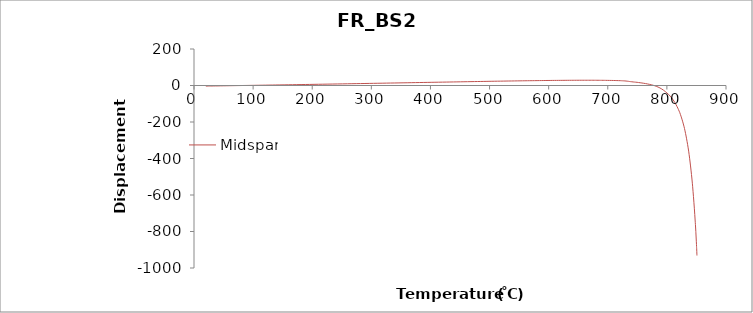
| Category | Midspan |
|---|---|
| 20.0 | -3.166 |
| 22.1093185 | -3.063 |
| 24.218637 | -2.959 |
| 26.3279555 | -2.855 |
| 28.437274 | -2.751 |
| 32.499335 | -2.55 |
| 36.561396 | -2.349 |
| 40.623457 | -2.148 |
| 44.685518 | -1.945 |
| 49.893662 | -1.685 |
| 55.101806 | -1.424 |
| 60.30995 | -1.163 |
| 65.518094 | -0.9 |
| 71.48998275 | -0.598 |
| 77.4618715 | -0.294 |
| 83.43376025 | 0.01 |
| 89.405649 | 0.316 |
| 95.907004 | 0.65 |
| 102.408359 | 0.984 |
| 108.909714 | 1.318 |
| 115.411069 | 1.653 |
| 121.1174785 | 1.948 |
| 126.823888 | 2.244 |
| 132.5302975 | 2.541 |
| 138.236707 | 2.839 |
| 145.3285415 | 3.211 |
| 152.420376 | 3.584 |
| 159.5122105 | 3.959 |
| 166.604045 | 4.336 |
| 173.87464425 | 4.724 |
| 181.1452435 | 5.113 |
| 188.41584275 | 5.504 |
| 195.686442 | 5.897 |
| 203.058233 | 6.294 |
| 210.430024 | 6.69 |
| 217.801815 | 7.088 |
| 225.173606 | 7.487 |
| 233.811487 | 7.957 |
| 242.449368 | 8.429 |
| 251.087249 | 8.904 |
| 259.72513 | 9.38 |
| 267.0905145 | 9.788 |
| 274.455899 | 10.198 |
| 281.8212835 | 10.609 |
| 289.186668 | 11.021 |
| 296.4560575 | 11.43 |
| 303.725447 | 11.838 |
| 310.9948365 | 12.243 |
| 318.264226 | 12.65 |
| 325.384818 | 13.051 |
| 332.50541 | 13.452 |
| 339.626002 | 13.855 |
| 346.746594 | 14.259 |
| 353.67071425 | 14.653 |
| 360.5948345 | 15.048 |
| 367.51895475 | 15.444 |
| 374.443075 | 15.841 |
| 381.12936825 | 16.226 |
| 387.8156615 | 16.612 |
| 394.50195475 | 16.999 |
| 401.188248 | 17.384 |
| 407.6028095 | 17.744 |
| 414.017371 | 18.104 |
| 420.4319325 | 18.465 |
| 426.846494 | 18.826 |
| 432.806323875 | 19.161 |
| 438.76615375 | 19.497 |
| 444.725983625 | 19.832 |
| 450.6858135 | 20.168 |
| 456.645643375 | 20.503 |
| 462.60547325 | 20.839 |
| 468.565303125 | 21.174 |
| 474.525133 | 21.508 |
| 479.42299225 | 21.782 |
| 484.3208515 | 22.056 |
| 489.21871075 | 22.329 |
| 494.11657 | 22.602 |
| 499.01442925 | 22.874 |
| 503.9122885 | 23.131 |
| 508.81014775 | 23.384 |
| 513.708007 | 23.635 |
| 518.436626 | 23.875 |
| 523.165245 | 24.113 |
| 527.893864 | 24.35 |
| 532.622483 | 24.584 |
| 537.351102 | 24.816 |
| 542.079721 | 25.046 |
| 546.80834 | 25.273 |
| 551.536959 | 25.497 |
| 555.665355875 | 25.688 |
| 559.79375275 | 25.877 |
| 563.922149625 | 26.063 |
| 568.0505465 | 26.247 |
| 572.178943375 | 26.428 |
| 576.30734025 | 26.606 |
| 580.435737125 | 26.781 |
| 584.564134 | 26.952 |
| 588.160569375 | 27.096 |
| 591.75700475 | 27.236 |
| 595.353440125 | 27.374 |
| 598.9498755 | 27.509 |
| 602.546310875 | 27.634 |
| 606.14274625 | 27.754 |
| 609.739181625 | 27.869 |
| 613.335617 | 27.98 |
| 616.49156975 | 28.07 |
| 619.6475225 | 28.156 |
| 622.80347525 | 28.239 |
| 625.959428 | 28.318 |
| 629.11538075 | 28.393 |
| 632.2713335 | 28.465 |
| 635.42728625 | 28.532 |
| 638.583239 | 28.594 |
| 641.332146375 | 28.638 |
| 644.08105375 | 28.679 |
| 646.829961125 | 28.715 |
| 649.5788685 | 28.748 |
| 652.327775875 | 28.777 |
| 655.07668325 | 28.801 |
| 657.825590625 | 28.821 |
| 660.574498 | 28.835 |
| 662.94476325 | 28.834 |
| 665.3150285 | 28.83 |
| 667.68529375 | 28.821 |
| 670.055559 | 28.808 |
| 672.42582425 | 28.791 |
| 674.7960895 | 28.768 |
| 677.16635475 | 28.741 |
| 679.53662 | 28.708 |
| 681.556307125 | 28.662 |
| 683.57599425 | 28.613 |
| 685.595681375 | 28.559 |
| 687.6153685 | 28.501 |
| 689.635055625 | 28.437 |
| 690.13997740625 | 28.421 |
| 692.15966453125 | 28.35 |
| 694.17935165625 | 28.274 |
| 696.11634171875 | 28.19 |
| 697.80524059375 | 28.099 |
| 699.49413946875 | 28.004 |
| 701.18303834375 | 27.922 |
| 702.87193721875 | 27.844 |
| 704.56083609375 | 27.761 |
| 706.24973496875 | 27.674 |
| 707.93863384375 | 27.581 |
| 709.570472125 | 27.481 |
| 711.031128625 | 27.372 |
| 712.491785125 | 27.259 |
| 713.952441625 | 27.141 |
| 715.413098125 | 27.017 |
| 716.873754625 | 26.887 |
| 718.334411125 | 26.751 |
| 719.795067625 | 26.608 |
| 721.13862440625 | 26.456 |
| 722.13088203125 | 26.295 |
| 723.12313965625 | 26.131 |
| 724.11539728125 | 25.962 |
| 725.10765490625 | 25.789 |
| 726.09991253125 | 25.611 |
| 727.09217015625 | 25.428 |
| 728.08442778125 | 25.24 |
| 728.9881863125 | 25.046 |
| 729.6264475625 | 24.846 |
| 730.2647088125 | 24.643 |
| 730.9029700625 | 24.438 |
| 731.5412313125 | 24.229 |
| 732.1794925625 | 24.016 |
| 732.8177538125 | 23.8 |
| 733.4560150625 | 23.581 |
| 734.04454453125 | 23.357 |
| 734.48387865625 | 23.129 |
| 734.92321278125 | 22.899 |
| 735.36254690625 | 22.666 |
| 735.80188103125 | 22.43 |
| 736.24121515625 | 22.192 |
| 736.68054928125 | 21.95 |
| 737.11988340625 | 21.705 |
| 737.6380974375 | 21.457 |
| 738.3929511875 | 21.202 |
| 739.1478049375 | 20.941 |
| 739.9026586875 | 20.671 |
| 740.6575124375 | 20.392 |
| 741.4123661875 | 20.105 |
| 742.1672199375 | 19.809 |
| 742.9220736875 | 19.504 |
| 743.78225553125 | 19.188 |
| 744.95842165625 | 18.856 |
| 746.13458778125 | 18.507 |
| 747.31075390625 | 18.139 |
| 748.48692003125 | 17.752 |
| 749.66308615625 | 17.344 |
| 750.83925228125 | 16.82 |
| 752.01541840625 | 16.283 |
| 753.27281784375 | 15.713 |
| 754.77391721875 | 15.093 |
| 756.27501659375 | 14.437 |
| 757.77611596875 | 13.745 |
| 759.27721534375 | 13.014 |
| 760.77831471875 | 12.241 |
| 762.27941409375 | 11.424 |
| 763.78051346875 | 10.56 |
| 765.313543 | 9.643 |
| 766.942363 | 8.66 |
| 768.571183 | 7.615 |
| 770.200003 | 6.505 |
| 771.828823 | 5.326 |
| 773.457643 | 4.069 |
| 775.086463 | 2.712 |
| 776.715283 | 1.262 |
| 778.33372828125 | -0.283 |
| 778.7305585625 | -0.677 |
| 780.3178796875 | -2.398 |
| 781.9052008125 | -4.279 |
| 783.4925219375 | -6.333 |
| 785.0798430625 | -8.541 |
| 786.6671641875 | -10.905 |
| 788.2544853125 | -13.517 |
| 789.8418064375 | -16.308 |
| 791.362033875 | -19.318 |
| 792.815167625 | -22.459 |
| 794.268301375 | -25.769 |
| 795.721435125 | -29.311 |
| 797.174568875 | -32.964 |
| 798.627702625 | -36.719 |
| 800.080836375 | -40.854 |
| 801.533970125 | -44.771 |
| 802.905027625 | -48.944 |
| 804.194008875 | -53.348 |
| 805.482990125 | -57.97 |
| 806.771971375 | -62.901 |
| 808.060952625 | -68.099 |
| 809.349933875 | -73.564 |
| 810.638915125 | -79.279 |
| 811.927896375 | -85.277 |
| 812.2501416875 | -86.768 |
| 813.4204511875 | -92.918 |
| 814.5512034375 | -99.453 |
| 815.6819556875 | -106.264 |
| 815.96464375 | -107.954 |
| 817.095396 | -115.005 |
| 817.3780840625 | -116.81 |
| 818.5088363125 | -124.261 |
| 819.6395885625 | -132.234 |
| 820.7703408125 | -140.541 |
| 821.86689678125 | -149.19 |
| 822.86086390625 | -158.249 |
| 823.85483103125 | -167.825 |
| 824.84879815625 | -177.878 |
| 825.84276528125 | -188.343 |
| 826.83673240625 | -199.288 |
| 827.83069953125 | -210.792 |
| 828.82466665625 | -222.853 |
| 829.79073465625 | -235.512 |
| 830.67310528125 | -248.664 |
| 831.55547590625 | -262.434 |
| 832.43784653125 | -276.826 |
| 833.32021715625 | -291.891 |
| 834.20258778125 | -307.682 |
| 835.08495840625 | -324.253 |
| 835.96732903125 | -341.6 |
| 836.82762571875 | -359.738 |
| 837.62170059375 | -378.679 |
| 838.41577546875 | -398.477 |
| 839.20985034375 | -419.206 |
| 840.00392521875 | -440.92 |
| 840.79800009375 | -463.643 |
| 841.59207496875 | -487.459 |
| 842.38614984375 | -512.447 |
| 843.16298740625 | -538.63 |
| 843.3442688125 | -545.238 |
| 843.52555021875 | -551.906 |
| 844.25067584375 | -579.858 |
| 844.97580146875 | -609.201 |
| 845.70092709375 | -640.032 |
| 846.42605271875 | -672.445 |
| 847.15117834375 | -706.558 |
| 847.162508431641 | -707.087 |
| 847.887634056641 | -742.696 |
| 848.068915462891 | -751.82 |
| 848.250196869141 | -761.052 |
| 848.961025626953 | -800.179 |
| 849.002982009766 | -802.628 |
| 849.044938392578 | -805.087 |
| 849.086894775391 | -807.555 |
| 849.128851158203 | -810.034 |
| 849.170807541016 | -812.524 |
| 849.842109666016 | -856.309 |
| 849.884066048828 | -859.072 |
| 850.051891580078 | -870.508 |
| 850.219717111328 | -882.385 |
| 850.261673494141 | -885.382 |
| 850.303629876953 | -888.411 |
| 850.345586259766 | -891.47 |
| 850.387542642578 | -894.559 |
| 850.429499025391 | -897.68 |
| 850.597324556641 | -910.754 |
| 850.765150087891 | -924.541 |
| 850.807106470703 | -928.034 |
| 850.849062853516 | -931.589 |
| 850.851685127441 | -931.812 |